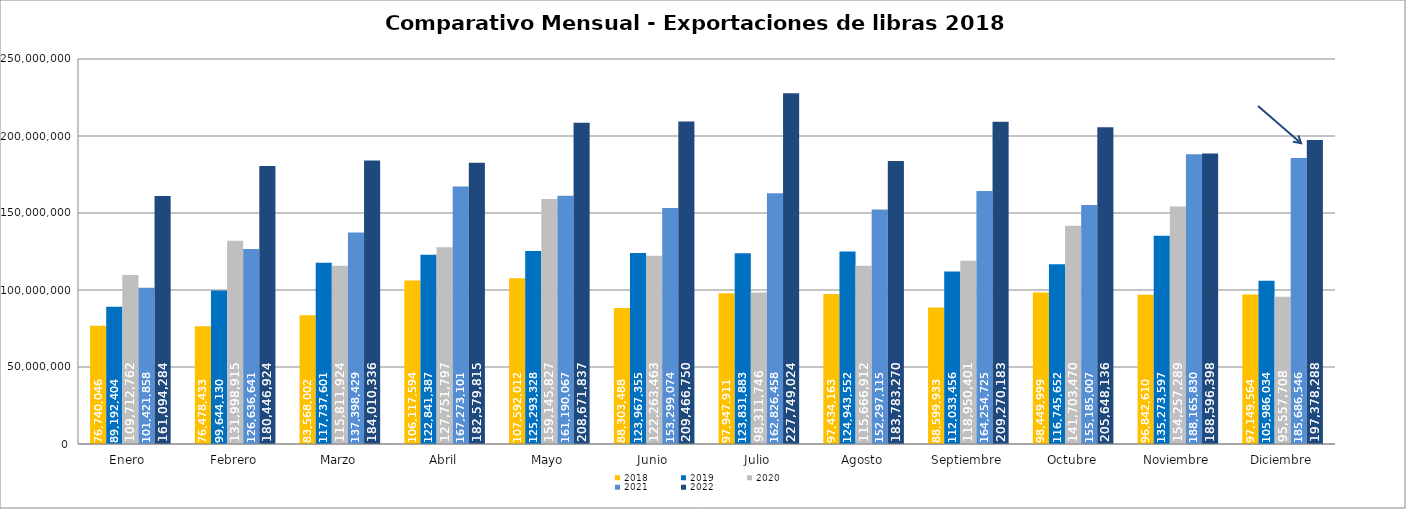
| Category | 2018 | 2019 | 2020 | 2021 | 2022 |
|---|---|---|---|---|---|
| Enero  | 76740046 | 89192404 | 109712762 | 101421858 | 161094284 |
| Febrero | 76478433 | 99644130 | 131998915 | 126636641 | 180446924 |
| Marzo | 83568002 | 117737601 | 115811924 | 137398429 | 184010336 |
| Abril | 106117594 | 122841387 | 127751797 | 167273101 | 182579815 |
| Mayo | 107592012 | 125293328 | 159145827 | 161190067 | 208671837 |
| Junio | 88303488 | 123967355 | 122263463 | 153299074 | 209466750 |
| Julio | 97947911 | 123831883 | 98311746 | 162826458 | 227749024 |
| Agosto | 97434163 | 124943552 | 115666912 | 152297115 | 183783270 |
| Septiembre | 88599933 | 112033456 | 118950401 | 164254725 | 209270183 |
| Octubre | 98449999 | 116745652 | 141703470 | 155185007 | 205648136 |
| Noviembre | 96842610 | 135273597 | 154257289 | 188165830 | 188596398 |
| Diciembre | 97149564 | 105986034 | 95557708 | 185686546 | 197378288 |